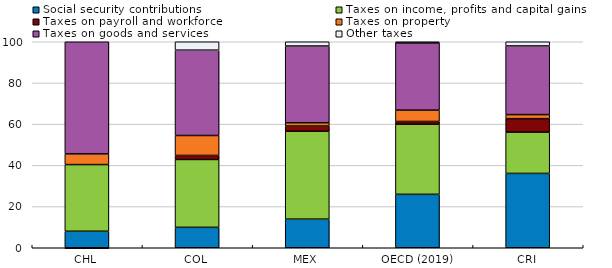
| Category | Social security contributions | Taxes on income, profits and capital gains | Taxes on payroll and workforce | Taxes on property | Taxes on goods and services | Other taxes |
|---|---|---|---|---|---|---|
| CHL | 8.013 | 32.365 | 0 | 5.19 | 54.884 | -0.452 |
| COL | 9.92 | 32.938 | 1.956 | 9.681 | 41.432 | 4.074 |
| MEX | 13.892 | 42.655 | 2.543 | 1.603 | 37.243 | 2.064 |
| OECD (2019) | 25.939 | 34.021 | 1.335 | 5.527 | 32.634 | 0.544 |
| CRI | 36.083 | 20.05 | 6.528 | 1.979 | 33.333 | 2.027 |